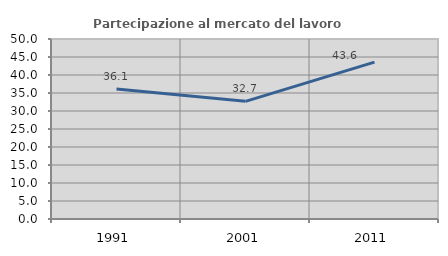
| Category | Partecipazione al mercato del lavoro  femminile |
|---|---|
| 1991.0 | 36.134 |
| 2001.0 | 32.681 |
| 2011.0 | 43.573 |